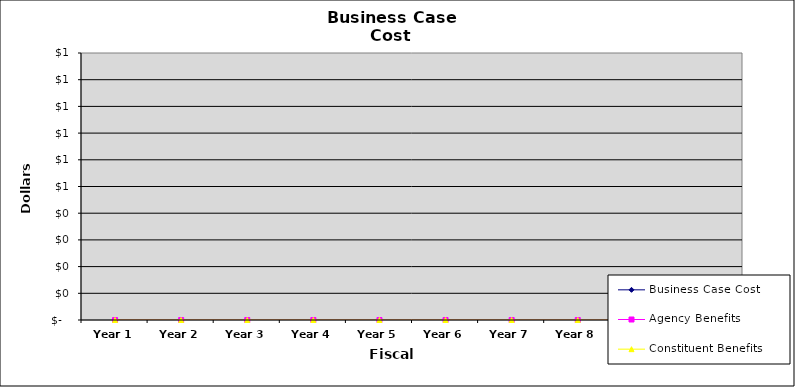
| Category | Business Case Cost | Agency Benefits | Constituent Benefits |
|---|---|---|---|
| Year 1 | 0 | 0 | 0 |
| Year 2 | 0 | 0 | 0 |
| Year 3 | 0 | 0 | 0 |
| Year 4 | 0 | 0 | 0 |
| Year 5 | 0 | 0 | 0 |
| Year 6 | 0 | 0 | 0 |
| Year 7 | 0 | 0 | 0 |
| Year 8 | 0 | 0 | 0 |
| Year 9 | 0 | 0 | 0 |
| Year 10 | 0 | 0 | 0 |